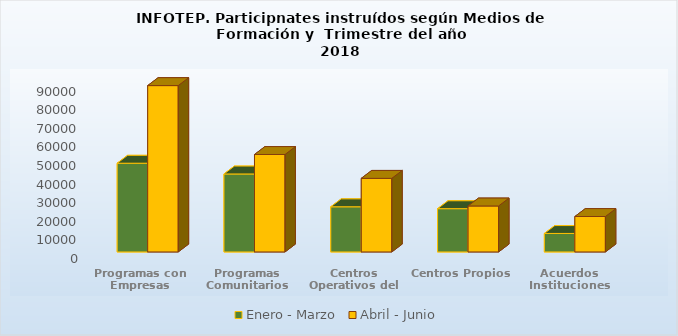
| Category | Enero - Marzo | Abril - Junio |
|---|---|---|
| Programas con Empresas | 47746 | 89521 |
| Programas Comunitarios | 41966 | 52444 |
| Centros Operativos del Sistema | 24310 | 39603 |
| Centros Propios | 23290 | 24738 |
| Acuerdos Instituciones | 9954 | 19069 |